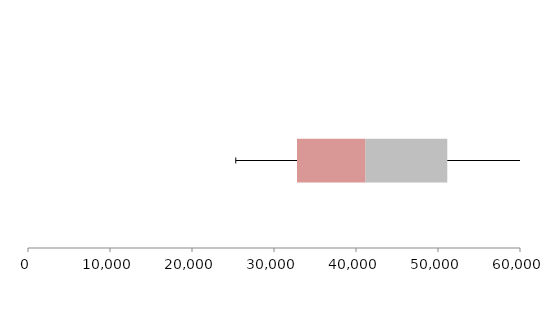
| Category | Series 1 | Series 2 | Series 3 |
|---|---|---|---|
| 0 | 32806.024 | 8362.283 | 9962.634 |